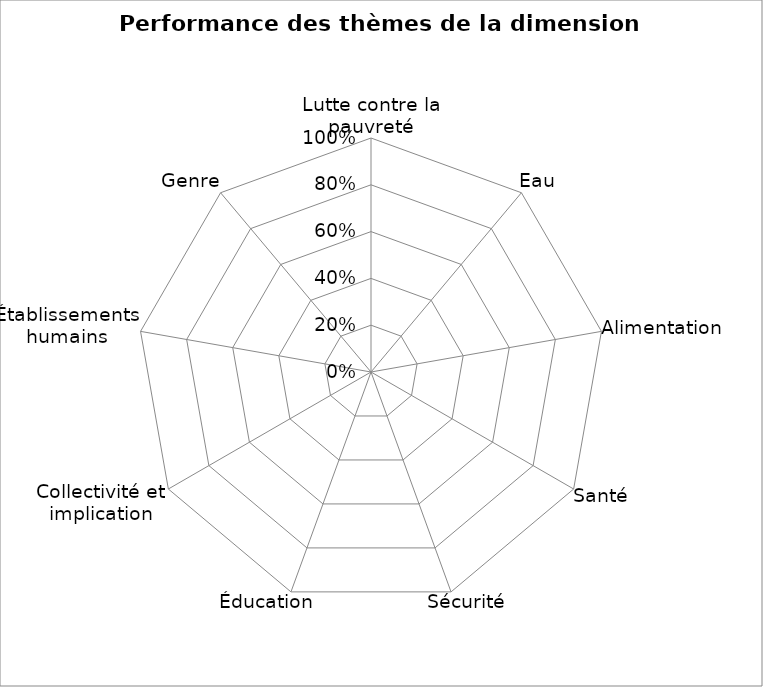
| Category | Series 1 | Series 0 |
|---|---|---|
| Lutte contre la pauvreté | 0 | 0 |
| Eau | 0 | 0 |
| Alimentation | 0 | 0 |
| Santé | 0 | 0 |
| Sécurité | 0 | 0 |
| Éducation | 0 | 0 |
| Collectivité et implication | 0 | 0 |
| Établissements humains | 0 | 0 |
| Genre | 0 | 0 |